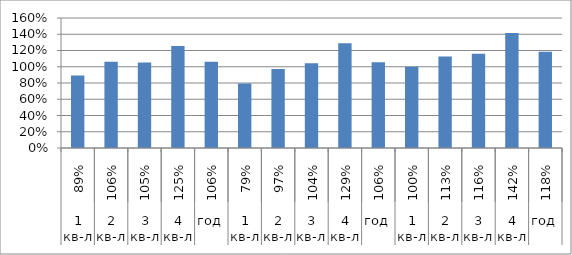
| Category | Series 0 |
|---|---|
| 0 | 0.893 |
| 1 | 1.061 |
| 2 | 1.051 |
| 3 | 1.254 |
| 4 | 1.061 |
| 5 | 0.793 |
| 6 | 0.972 |
| 7 | 1.044 |
| 8 | 1.289 |
| 9 | 1.056 |
| 10 | 0.999 |
| 11 | 1.127 |
| 12 | 1.159 |
| 13 | 1.415 |
| 14 | 1.183 |